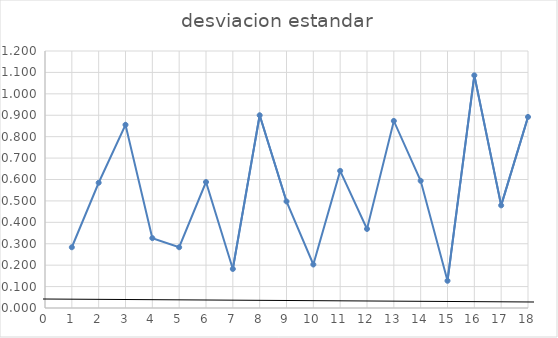
| Category | Series 0 |
|---|---|
| 1.0 | 0.284 |
| 2.0 | 0.585 |
| 3.0 | 0.856 |
| 4.0 | 0.326 |
| 5.0 | 0.284 |
| 6.0 | 0.588 |
| 7.0 | 0.182 |
| 8.0 | 0.9 |
| 9.0 | 0.498 |
| 10.0 | 0.203 |
| 11.0 | 0.64 |
| 12.0 | 0.369 |
| 13.0 | 0.873 |
| 14.0 | 0.594 |
| 15.0 | 0.127 |
| 16.0 | 1.086 |
| 17.0 | 0.479 |
| 18.0 | 0.892 |